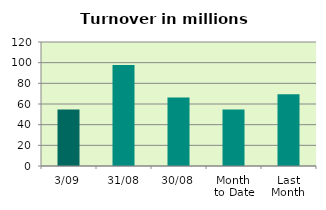
| Category | Series 0 |
|---|---|
| 3/09 | 54.624 |
| 31/08 | 97.828 |
| 30/08 | 66.327 |
| Month 
to Date | 54.624 |
| Last
Month | 69.378 |